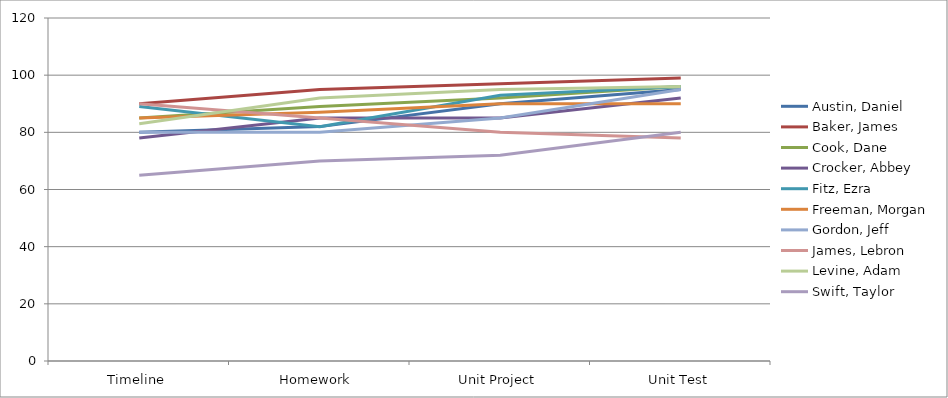
| Category | Austin, Daniel | Baker, James | Cook, Dane | Crocker, Abbey | Fitz, Ezra | Freeman, Morgan | Gordon, Jeff | James, Lebron | Levine, Adam | Swift, Taylor |
|---|---|---|---|---|---|---|---|---|---|---|
| Timeline | 80 | 90 | 85 | 78 | 89 | 85 | 80 | 90 | 83 | 65 |
| Homework  | 82 | 95 | 89 | 85 | 82 | 87 | 80 | 85 | 92 | 70 |
| Unit Project | 90 | 97 | 92 | 85 | 93 | 90 | 85 | 80 | 95 | 72 |
| Unit Test | 95 | 99 | 96 | 92 | 96 | 90 | 95 | 78 | 96 | 80 |